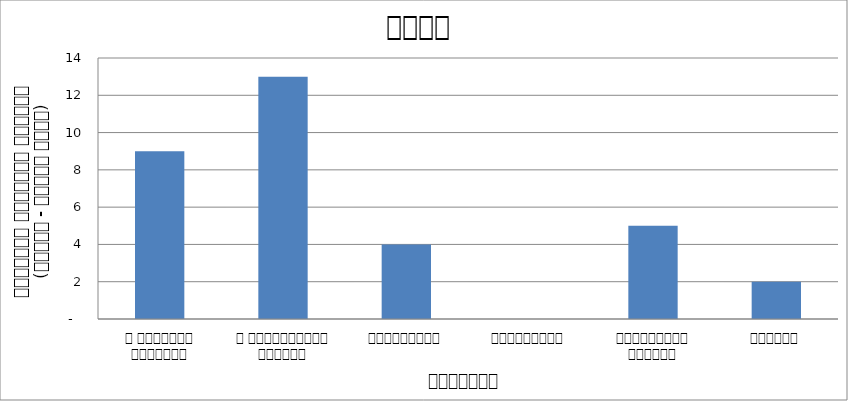
| Category | समाज |
|---|---|
| द हिमालयन टाइम्स् | 9 |
| द काठमाण्डौं पोस्ट् | 13 |
| रिपब्लिका | 4 |
| कान्तिपुर | 0 |
| अन्नपूर्ण पोस्ट् | 5 |
| नागरिक | 2 |